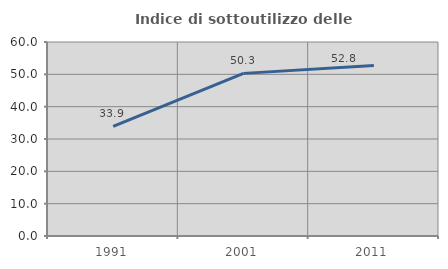
| Category | Indice di sottoutilizzo delle abitazioni  |
|---|---|
| 1991.0 | 33.885 |
| 2001.0 | 50.296 |
| 2011.0 | 52.769 |